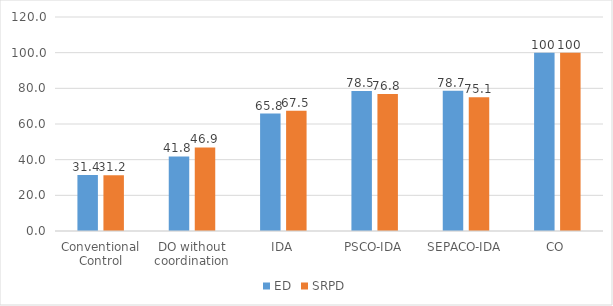
| Category | ED | SRPD |
|---|---|---|
| Conventional Control | 31.351 | 31.211 |
| DO without coordination | 41.82 | 46.862 |
| IDA | 65.828 | 67.493 |
| PSCO-IDA | 78.481 | 76.844 |
| SEPACO-IDA | 78.712 | 75.069 |
| CO | 100 | 100 |